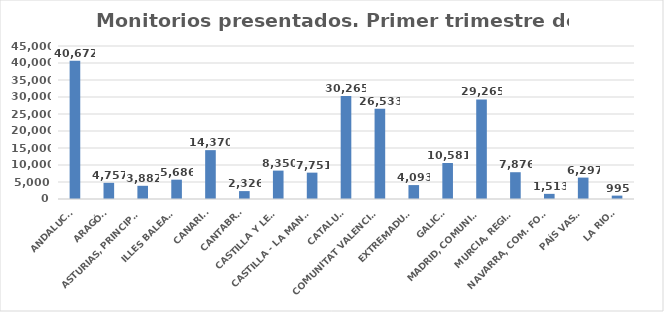
| Category | 616 |
|---|---|
| ANDALUCÍA | 40672 |
| ARAGÓN | 4757 |
| ASTURIAS, PRINCIPADO | 3882 |
| ILLES BALEARS | 5686 |
| CANARIAS | 14370 |
| CANTABRIA | 2326 |
| CASTILLA Y LEÓN | 8350 |
| CASTILLA - LA MANCHA | 7751 |
| CATALUÑA | 30265 |
| COMUNITAT VALENCIANA | 26533 |
| EXTREMADURA | 4093 |
| GALICIA | 10581 |
| MADRID, COMUNIDAD | 29265 |
| MURCIA, REGIÓN | 7876 |
| NAVARRA, COM. FORAL | 1513 |
| PAÍS VASCO | 6297 |
| LA RIOJA | 995 |